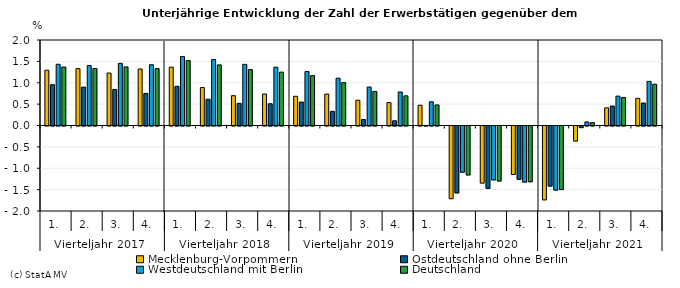
| Category | Mecklenburg-Vorpommern | Ostdeutschland ohne Berlin | Westdeutschland mit Berlin | Deutschland |
|---|---|---|---|---|
| 0 | 1.293 | 0.954 | 1.432 | 1.368 |
| 1 | 1.33 | 0.898 | 1.402 | 1.333 |
| 2 | 1.226 | 0.841 | 1.454 | 1.371 |
| 3 | 1.323 | 0.751 | 1.422 | 1.331 |
| 4 | 1.364 | 0.917 | 1.612 | 1.519 |
| 5 | 0.888 | 0.614 | 1.543 | 1.418 |
| 6 | 0.697 | 0.518 | 1.431 | 1.307 |
| 7 | 0.737 | 0.509 | 1.364 | 1.249 |
| 8 | 0.683 | 0.549 | 1.262 | 1.167 |
| 9 | 0.735 | 0.33 | 1.107 | 1.003 |
| 10 | 0.591 | 0.138 | 0.899 | 0.797 |
| 11 | 0.536 | 0.11 | 0.784 | 0.694 |
| 12 | 0.474 | 0.001 | 0.554 | 0.481 |
| 13 | -1.701 | -1.566 | -1.081 | -1.145 |
| 14 | -1.335 | -1.46 | -1.26 | -1.287 |
| 15 | -1.134 | -1.247 | -1.312 | -1.304 |
| 16 | -1.728 | -1.405 | -1.5 | -1.487 |
| 17 | -0.353 | -0.038 | 0.083 | 0.067 |
| 18 | 0.413 | 0.455 | 0.687 | 0.656 |
| 19 | 0.636 | 0.527 | 1.032 | 0.965 |